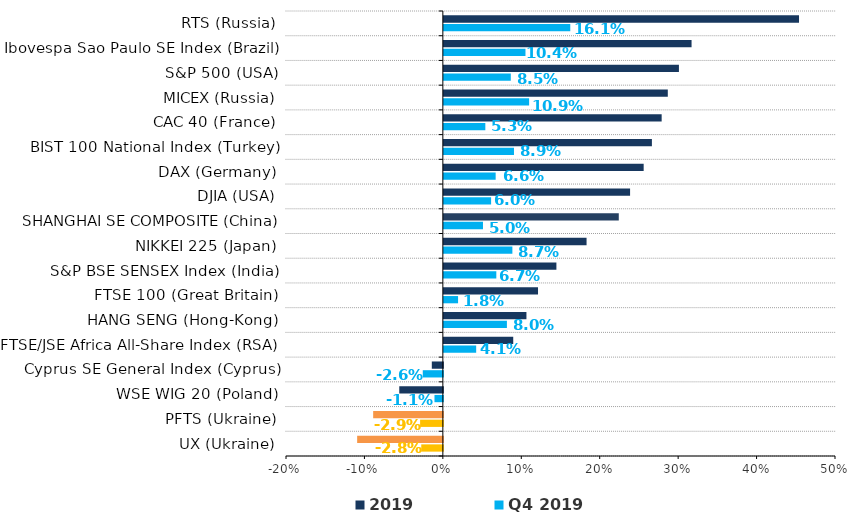
| Category | Q4 2019 | 2019 |
|---|---|---|
| UX (Ukraine) | -0.028 | -0.109 |
| PFTS (Ukraine) | -0.029 | -0.089 |
| WSE WIG 20 (Poland) | -0.011 | -0.056 |
| Cyprus SE General Index (Cyprus) | -0.026 | -0.014 |
| FTSE/JSE Africa All-Share Index (RSA) | 0.041 | 0.088 |
| HANG SENG (Hong-Kong) | 0.08 | 0.105 |
| FTSE 100 (Great Britain) | 0.018 | 0.12 |
| S&P BSE SENSEX Index (India) | 0.067 | 0.144 |
| NIKKEI 225 (Japan) | 0.087 | 0.182 |
| SHANGHAI SE COMPOSITE (China) | 0.05 | 0.223 |
| DJIA (USA) | 0.06 | 0.237 |
| DAX (Germany) | 0.066 | 0.255 |
| BIST 100 National Index (Тurkey) | 0.089 | 0.265 |
| CAC 40 (France) | 0.053 | 0.278 |
| MICEX (Russia) | 0.109 | 0.286 |
| S&P 500 (USA) | 0.085 | 0.3 |
| Ibovespa Sao Paulo SE Index (Brazil) | 0.104 | 0.316 |
| RTS (Russia) | 0.161 | 0.453 |